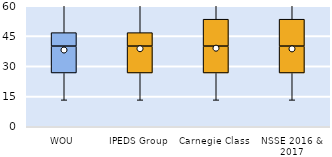
| Category | 25th | 50th | 75th |
|---|---|---|---|
| WOU | 26.667 | 13.333 | 6.667 |
| IPEDS Group | 26.667 | 13.333 | 6.667 |
| Carnegie Class | 26.667 | 13.333 | 13.333 |
| NSSE 2016 & 2017 | 26.667 | 13.333 | 13.333 |